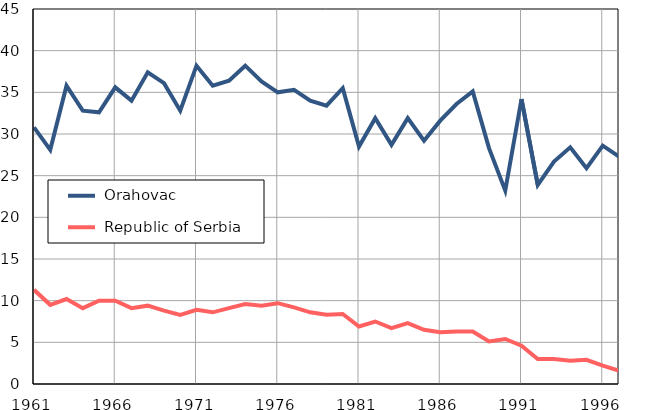
| Category |  Orahovac |  Republic of Serbia |
|---|---|---|
| 1961.0 | 30.8 | 11.3 |
| 1962.0 | 28.1 | 9.5 |
| 1963.0 | 35.8 | 10.2 |
| 1964.0 | 32.8 | 9.1 |
| 1965.0 | 32.6 | 10 |
| 1966.0 | 35.6 | 10 |
| 1967.0 | 34 | 9.1 |
| 1968.0 | 37.4 | 9.4 |
| 1969.0 | 36.1 | 8.8 |
| 1970.0 | 32.8 | 8.3 |
| 1971.0 | 38.2 | 8.9 |
| 1972.0 | 35.8 | 8.6 |
| 1973.0 | 36.4 | 9.1 |
| 1974.0 | 38.2 | 9.6 |
| 1975.0 | 36.3 | 9.4 |
| 1976.0 | 35 | 9.7 |
| 1977.0 | 35.3 | 9.2 |
| 1978.0 | 34 | 8.6 |
| 1979.0 | 33.4 | 8.3 |
| 1980.0 | 35.5 | 8.4 |
| 1981.0 | 28.5 | 6.9 |
| 1982.0 | 31.9 | 7.5 |
| 1983.0 | 28.7 | 6.7 |
| 1984.0 | 31.9 | 7.3 |
| 1985.0 | 29.2 | 6.5 |
| 1986.0 | 31.6 | 6.2 |
| 1987.0 | 33.6 | 6.3 |
| 1988.0 | 35.1 | 6.3 |
| 1989.0 | 28.3 | 5.1 |
| 1990.0 | 23.2 | 5.4 |
| 1991.0 | 34.2 | 4.6 |
| 1992.0 | 23.9 | 3 |
| 1993.0 | 26.7 | 3 |
| 1994.0 | 28.4 | 2.8 |
| 1995.0 | 25.9 | 2.9 |
| 1996.0 | 28.6 | 2.2 |
| 1997.0 | 27.3 | 1.6 |